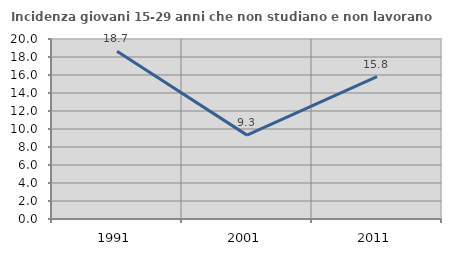
| Category | Incidenza giovani 15-29 anni che non studiano e non lavorano  |
|---|---|
| 1991.0 | 18.651 |
| 2001.0 | 9.319 |
| 2011.0 | 15.828 |